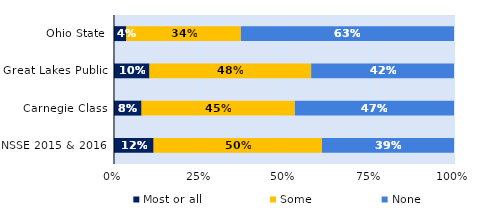
| Category | Most or all | Some | None |
|---|---|---|---|
| Ohio State | 0.036 | 0.337 | 0.627 |
| Great Lakes Public | 0.104 | 0.475 | 0.42 |
| Carnegie Class | 0.081 | 0.451 | 0.468 |
| NSSE 2015 & 2016 | 0.117 | 0.495 | 0.388 |